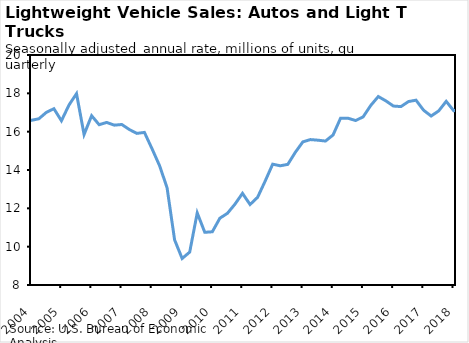
| Category | Light Weight Vehicle Sales: Autos and Light Trucks, Millions of Units |
|---|---|
| 1976-01-01 | 12.88 |
| 1976-04-01 | 12.762 |
| 1976-07-01 | 12.975 |
| 1976-10-01 | 13.247 |
| 1977-01-01 | 14.379 |
| 1977-04-01 | 14.643 |
| 1977-07-01 | 14.356 |
| 1977-10-01 | 14.565 |
| 1978-01-01 | 14.006 |
| 1978-04-01 | 15.818 |
| 1978-07-01 | 14.986 |
| 1978-10-01 | 15.082 |
| 1979-01-01 | 14.774 |
| 1979-04-01 | 13.544 |
| 1979-07-01 | 13.888 |
| 1979-10-01 | 12.866 |
| 1980-01-01 | 12.96 |
| 1980-04-01 | 9.896 |
| 1980-07-01 | 10.954 |
| 1980-10-01 | 10.959 |
| 1981-01-01 | 11.779 |
| 1981-04-01 | 10.184 |
| 1981-07-01 | 11.175 |
| 1981-10-01 | 9.117 |
| 1982-01-01 | 10.419 |
| 1982-04-01 | 9.954 |
| 1982-07-01 | 10.107 |
| 1982-10-01 | 10.973 |
| 1983-01-01 | 10.654 |
| 1983-04-01 | 12.052 |
| 1983-07-01 | 12.346 |
| 1983-10-01 | 13.427 |
| 1984-01-01 | 14.032 |
| 1984-04-01 | 14.352 |
| 1984-07-01 | 14.041 |
| 1984-10-01 | 14.364 |
| 1985-01-01 | 15.249 |
| 1985-04-01 | 15.098 |
| 1985-07-01 | 16.888 |
| 1985-10-01 | 14.536 |
| 1986-01-01 | 14.936 |
| 1986-04-01 | 15.751 |
| 1986-07-01 | 17.901 |
| 1986-10-01 | 15.614 |
| 1987-01-01 | 14.001 |
| 1987-04-01 | 14.93 |
| 1987-07-01 | 15.993 |
| 1987-10-01 | 14.519 |
| 1988-01-01 | 15.93 |
| 1988-04-01 | 15.444 |
| 1988-07-01 | 15.054 |
| 1988-10-01 | 15.317 |
| 1989-01-01 | 14.682 |
| 1989-04-01 | 14.902 |
| 1989-07-01 | 15.328 |
| 1989-10-01 | 13.204 |
| 1990-01-01 | 14.76 |
| 1990-04-01 | 13.873 |
| 1990-07-01 | 13.799 |
| 1990-10-01 | 13.021 |
| 1991-01-01 | 12.129 |
| 1991-04-01 | 12.2 |
| 1991-07-01 | 12.661 |
| 1991-10-01 | 12.266 |
| 1992-01-01 | 12.552 |
| 1992-04-01 | 12.829 |
| 1992-07-01 | 12.778 |
| 1992-10-01 | 13.28 |
| 1993-01-01 | 12.977 |
| 1993-04-01 | 14.212 |
| 1993-07-01 | 13.698 |
| 1993-10-01 | 14.607 |
| 1994-01-01 | 15.068 |
| 1994-04-01 | 14.897 |
| 1994-07-01 | 14.807 |
| 1994-10-01 | 15.404 |
| 1995-01-01 | 14.562 |
| 1995-04-01 | 14.472 |
| 1995-07-01 | 14.764 |
| 1995-10-01 | 15.115 |
| 1996-01-01 | 15.114 |
| 1996-04-01 | 15.2 |
| 1996-07-01 | 15.004 |
| 1996-10-01 | 15.071 |
| 1997-01-01 | 15.231 |
| 1997-04-01 | 14.53 |
| 1997-07-01 | 15.223 |
| 1997-10-01 | 15.505 |
| 1998-01-01 | 14.747 |
| 1998-04-01 | 16.183 |
| 1998-07-01 | 14.825 |
| 1998-10-01 | 16.418 |
| 1999-01-01 | 16.331 |
| 1999-04-01 | 16.773 |
| 1999-07-01 | 17.136 |
| 1999-10-01 | 17.335 |
| 2000-01-01 | 18.272 |
| 2000-04-01 | 17.329 |
| 2000-07-01 | 17.395 |
| 2000-10-01 | 16.402 |
| 2001-01-01 | 17.184 |
| 2001-04-01 | 16.713 |
| 2001-07-01 | 16.065 |
| 2001-10-01 | 18.527 |
| 2002-01-01 | 16.671 |
| 2002-04-01 | 16.604 |
| 2002-07-01 | 17.42 |
| 2002-10-01 | 16.57 |
| 2003-01-01 | 16.138 |
| 2003-04-01 | 16.424 |
| 2003-07-01 | 17.218 |
| 2003-10-01 | 16.777 |
| 2004-01-01 | 16.592 |
| 2004-04-01 | 16.671 |
| 2004-07-01 | 17.006 |
| 2004-10-01 | 17.198 |
| 2005-01-01 | 16.568 |
| 2005-04-01 | 17.39 |
| 2005-07-01 | 17.984 |
| 2005-10-01 | 15.852 |
| 2006-01-01 | 16.832 |
| 2006-04-01 | 16.363 |
| 2006-07-01 | 16.482 |
| 2006-10-01 | 16.34 |
| 2007-01-01 | 16.374 |
| 2007-04-01 | 16.111 |
| 2007-07-01 | 15.911 |
| 2007-10-01 | 15.961 |
| 2008-01-01 | 15.115 |
| 2008-04-01 | 14.232 |
| 2008-07-01 | 13.079 |
| 2008-10-01 | 10.354 |
| 2009-01-01 | 9.383 |
| 2009-04-01 | 9.716 |
| 2009-07-01 | 11.762 |
| 2009-10-01 | 10.749 |
| 2010-01-01 | 10.777 |
| 2010-04-01 | 11.485 |
| 2010-07-01 | 11.74 |
| 2010-10-01 | 12.217 |
| 2011-01-01 | 12.782 |
| 2011-04-01 | 12.199 |
| 2011-07-01 | 12.574 |
| 2011-10-01 | 13.417 |
| 2012-01-01 | 14.304 |
| 2012-04-01 | 14.22 |
| 2012-07-01 | 14.293 |
| 2012-10-01 | 14.922 |
| 2013-01-01 | 15.467 |
| 2013-04-01 | 15.587 |
| 2013-07-01 | 15.555 |
| 2013-10-01 | 15.51 |
| 2014-01-01 | 15.825 |
| 2014-04-01 | 16.704 |
| 2014-07-01 | 16.7 |
| 2014-10-01 | 16.58 |
| 2015-01-01 | 16.776 |
| 2015-04-01 | 17.368 |
| 2015-07-01 | 17.833 |
| 2015-10-01 | 17.608 |
| 2016-01-01 | 17.337 |
| 2016-04-01 | 17.308 |
| 2016-07-01 | 17.571 |
| 2016-10-01 | 17.643 |
| 2017-01-01 | 17.12 |
| 2017-04-01 | 16.816 |
| 2017-07-01 | 17.08 |
| 2017-10-01 | 17.582 |
| 2018-01-01 | 17.091 |
| 2018-04-01 | 17.207 |
| 2018-07-01 | 16.9 |